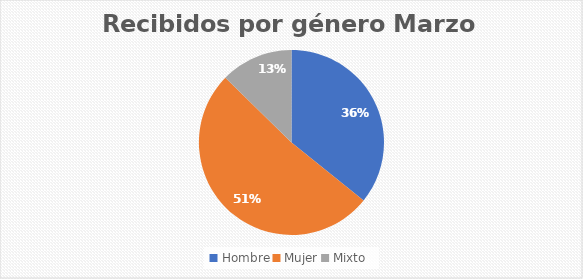
| Category | Recibidos por género  Marzo |
|---|---|
| Hombre | 127 |
| Mujer | 183 |
| Mixto | 45 |